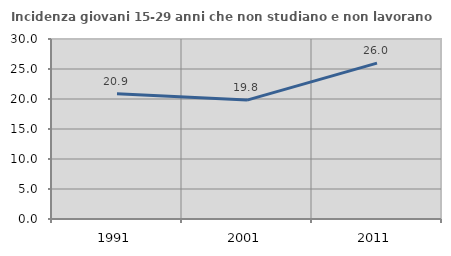
| Category | Incidenza giovani 15-29 anni che non studiano e non lavorano  |
|---|---|
| 1991.0 | 20.885 |
| 2001.0 | 19.82 |
| 2011.0 | 25.974 |